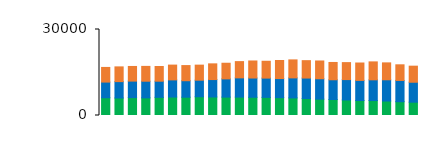
| Category | North |
|---|---|
| 0 | 5110 |
| 1 | 5139 |
| 2 | 5109 |
| 3 | 5172 |
| 4 | 5126 |
| 5 | 5161 |
| 6 | 5285 |
| 7 | 5249 |
| 8 | 5480 |
| 9 | 5457 |
| 10 | 5672 |
| 11 | 5944 |
| 12 | 5876 |
| 13 | 6311 |
| 14 | 6278 |
| 15 | 6069 |
| 16 | 6205 |
| 17 | 6039 |
| 18 | 5920 |
| 19 | 6067 |
| 20 | 6261 |
| 21 | 5897 |
| 22 | 5454 |
| 23 | 5609 |